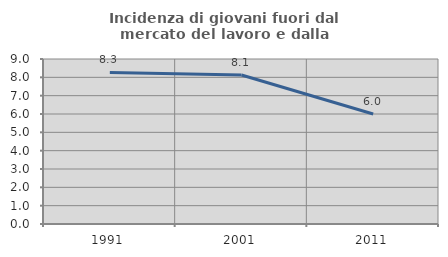
| Category | Incidenza di giovani fuori dal mercato del lavoro e dalla formazione  |
|---|---|
| 1991.0 | 8.264 |
| 2001.0 | 8.13 |
| 2011.0 | 6 |